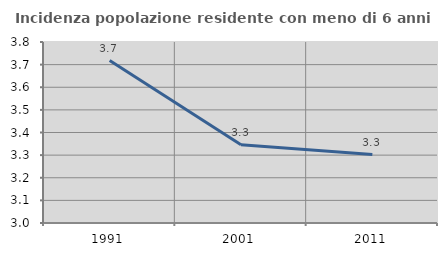
| Category | Incidenza popolazione residente con meno di 6 anni |
|---|---|
| 1991.0 | 3.718 |
| 2001.0 | 3.346 |
| 2011.0 | 3.303 |